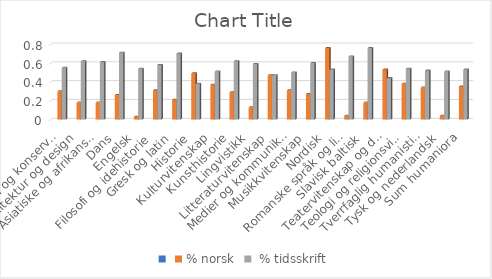
| Category | Series 0 | % norsk |  % tidsskrift |
|---|---|---|---|
| Arkeologi og konservering |  | 0.3 | 0.55 |
| Arkitektur og design |  | 0.18 | 0.62 |
| Asiatiske og afrikanske studier |  | 0.18 | 0.61 |
| Dans |  | 0.26 | 0.71 |
| Engelsk |  | 0.03 | 0.54 |
| Filosofi og idehistorie |  | 0.31 | 0.58 |
| Gresk og latin |  | 0.21 | 0.7 |
| Historie |  | 0.49 | 0.38 |
| Kulturvitenskap |  | 0.37 | 0.51 |
| Kunsthistorie |  | 0.29 | 0.62 |
| Lingvistikk |  | 0.13 | 0.59 |
| Litteraturvitenskap |  | 0.47 | 0.47 |
| Medier og kommunikasjon |  | 0.31 | 0.5 |
| Musikkvitenskap |  | 0.27 | 0.6 |
| Nordisk |  | 0.76 | 0.53 |
| Romanske språk og litteratur |  | 0.04 | 0.67 |
| Slavisk baltisk |  | 0.18 | 0.76 |
| Teatervitenskap og drama |  | 0.53 | 0.44 |
| Teologi og religionsvitenskap |  | 0.38 | 0.54 |
| Tverrfaglig humanistisk forskning |  | 0.34 | 0.52 |
| Tysk og nederlandsk |  | 0.04 | 0.51 |
| Sum humaniora |  | 0.35 | 0.53 |